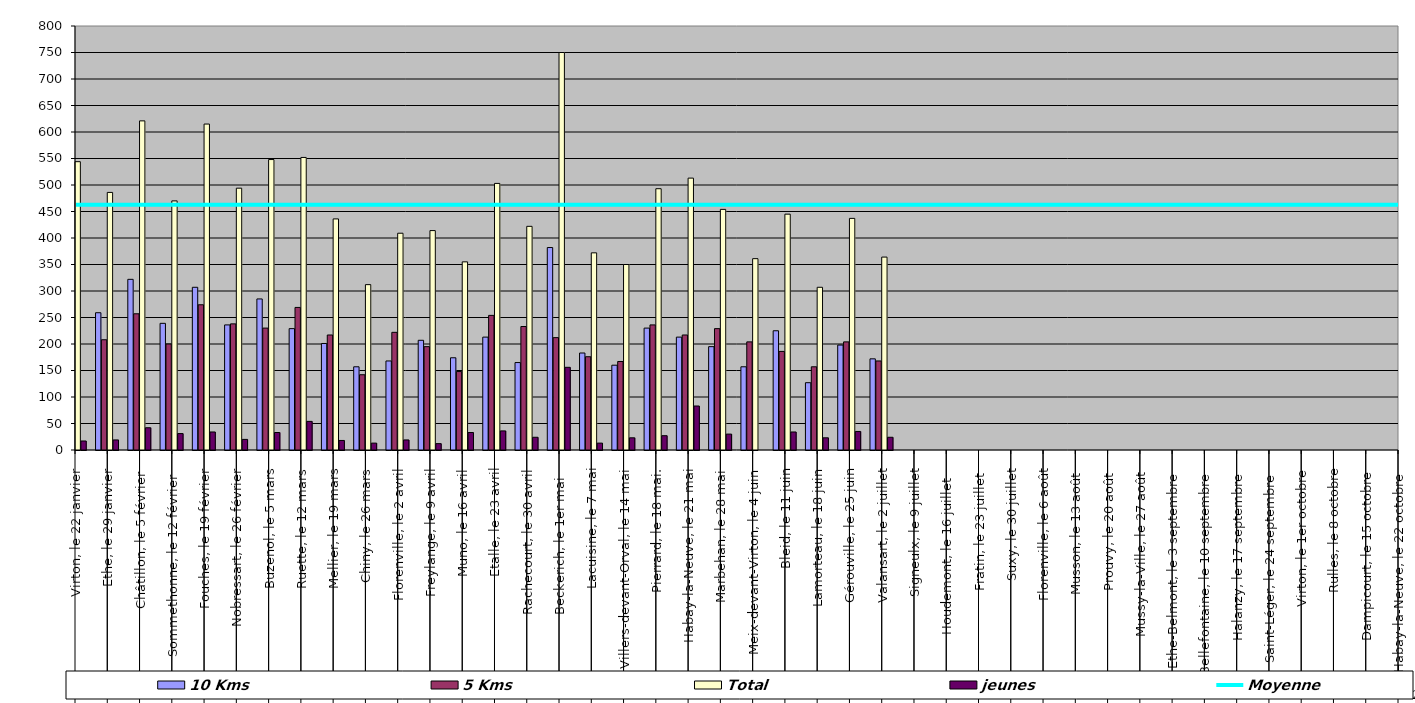
| Category | 10 Kms | 5 Kms | Total | jeunes |
|---|---|---|---|---|
| 0 | 296 | 231 | 544 | 17 |
| 1 | 259 | 208 | 486 | 19 |
| 2 | 322 | 257 | 621 | 42 |
| 3 | 239 | 200 | 470 | 31 |
| 4 | 307 | 274 | 615 | 34 |
| 5 | 236 | 238 | 494 | 20 |
| 6 | 285 | 230 | 548 | 33 |
| 7 | 229 | 269 | 552 | 54 |
| 8 | 201 | 217 | 436 | 18 |
| 9 | 157 | 142 | 312 | 13 |
| 10 | 168 | 222 | 409 | 19 |
| 11 | 207 | 195 | 414 | 12 |
| 12 | 174 | 148 | 355 | 33 |
| 13 | 213 | 254 | 503 | 36 |
| 14 | 165 | 233 | 422 | 24 |
| 15 | 382 | 212 | 750 | 156 |
| 16 | 183 | 176 | 372 | 13 |
| 17 | 160 | 167 | 350 | 23 |
| 18 | 230 | 236 | 493 | 27 |
| 19 | 213 | 217 | 513 | 83 |
| 20 | 195 | 229 | 454 | 30 |
| 21 | 157 | 204 | 361 | 0 |
| 22 | 225 | 186 | 445 | 34 |
| 23 | 127 | 157 | 307 | 23 |
| 24 | 198 | 204 | 437 | 35 |
| 25 | 172 | 168 | 364 | 24 |
| 26 | 0 | 0 | 0 | 0 |
| 27 | 0 | 0 | 0 | 0 |
| 28 | 0 | 0 | 0 | 0 |
| 29 | 0 | 0 | 0 | 0 |
| 30 | 0 | 0 | 0 | 0 |
| 31 | 0 | 0 | 0 | 0 |
| 32 | 0 | 0 | 0 | 0 |
| 33 | 0 | 0 | 0 | 0 |
| 34 | 0 | 0 | 0 | 0 |
| 35 | 0 | 0 | 0 | 0 |
| 36 | 0 | 0 | 0 | 0 |
| 37 | 0 | 0 | 0 | 0 |
| 38 | 0 | 0 | 0 | 0 |
| 39 | 0 | 0 | 0 | 0 |
| 40 | 0 | 0 | 0 | 0 |
| 41 | 0 | 0 | 0 | 0 |